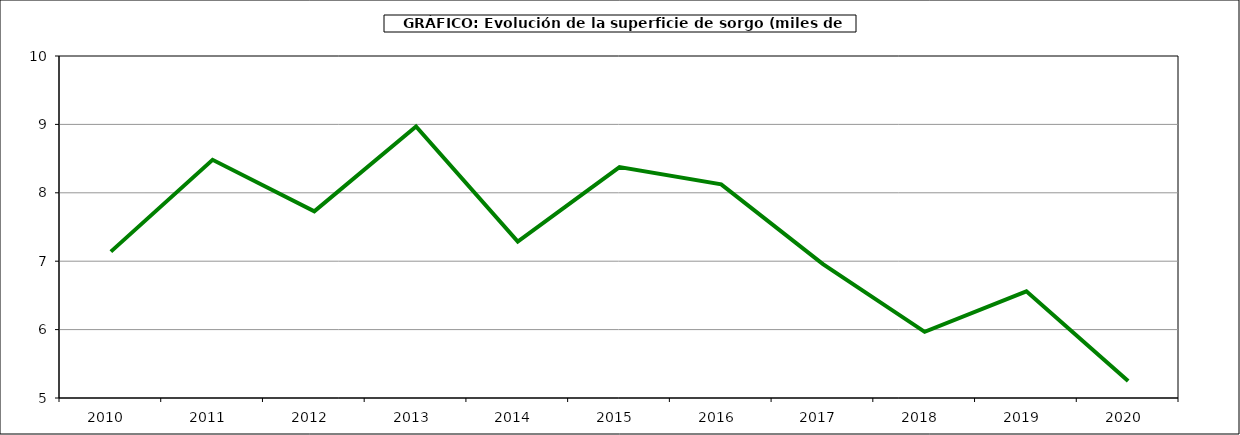
| Category | Superficie |
|---|---|
| 2010.0 | 7.14 |
| 2011.0 | 8.482 |
| 2012.0 | 7.729 |
| 2013.0 | 8.97 |
| 2014.0 | 7.288 |
| 2015.0 | 8.375 |
| 2016.0 | 8.124 |
| 2017.0 | 6.958 |
| 2018.0 | 5.967 |
| 2019.0 | 6.56 |
| 2020.0 | 5.248 |